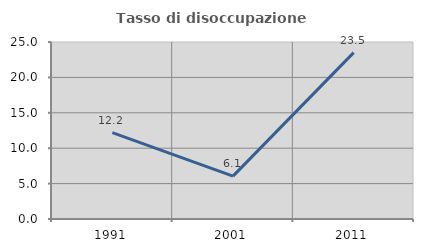
| Category | Tasso di disoccupazione giovanile  |
|---|---|
| 1991.0 | 12.211 |
| 2001.0 | 6.054 |
| 2011.0 | 23.497 |